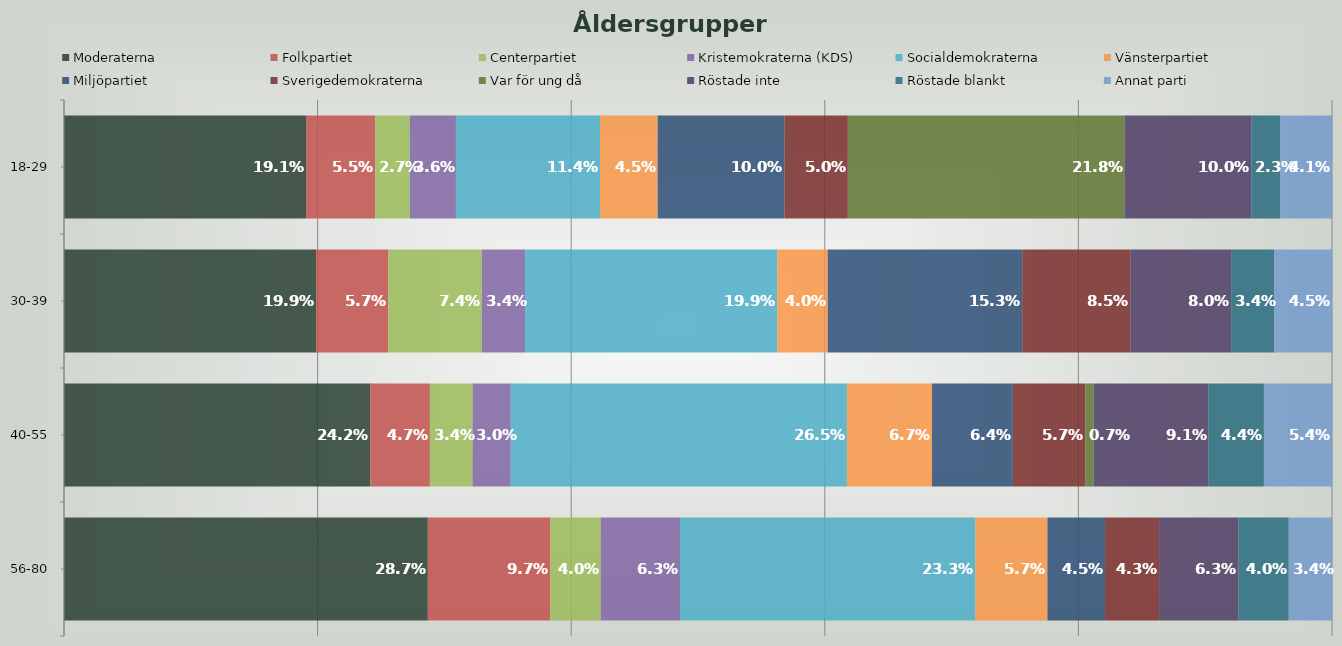
| Category | Moderaterna | Folkpartiet | Centerpartiet | Kristemokraterna (KDS) | Socialdemokraterna | Vänsterpartiet | Miljöpartiet | Sverigedemokraterna | Var för ung då | Röstade inte | Röstade blankt | Annat parti |
|---|---|---|---|---|---|---|---|---|---|---|---|---|
| 18-29 | 0.191 | 0.055 | 0.027 | 0.036 | 0.114 | 0.045 | 0.1 | 0.05 | 0.218 | 0.1 | 0.023 | 0.041 |
| 30-39 | 0.199 | 0.057 | 0.074 | 0.034 | 0.199 | 0.04 | 0.153 | 0.085 | 0 | 0.08 | 0.034 | 0.045 |
| 40-55 | 0.242 | 0.047 | 0.034 | 0.03 | 0.265 | 0.067 | 0.064 | 0.057 | 0.007 | 0.091 | 0.044 | 0.054 |
| 56-80 | 0.287 | 0.097 | 0.04 | 0.062 | 0.233 | 0.057 | 0.045 | 0.043 | 0 | 0.062 | 0.04 | 0.034 |